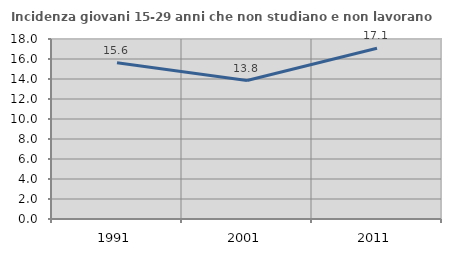
| Category | Incidenza giovani 15-29 anni che non studiano e non lavorano  |
|---|---|
| 1991.0 | 15.63 |
| 2001.0 | 13.846 |
| 2011.0 | 17.073 |